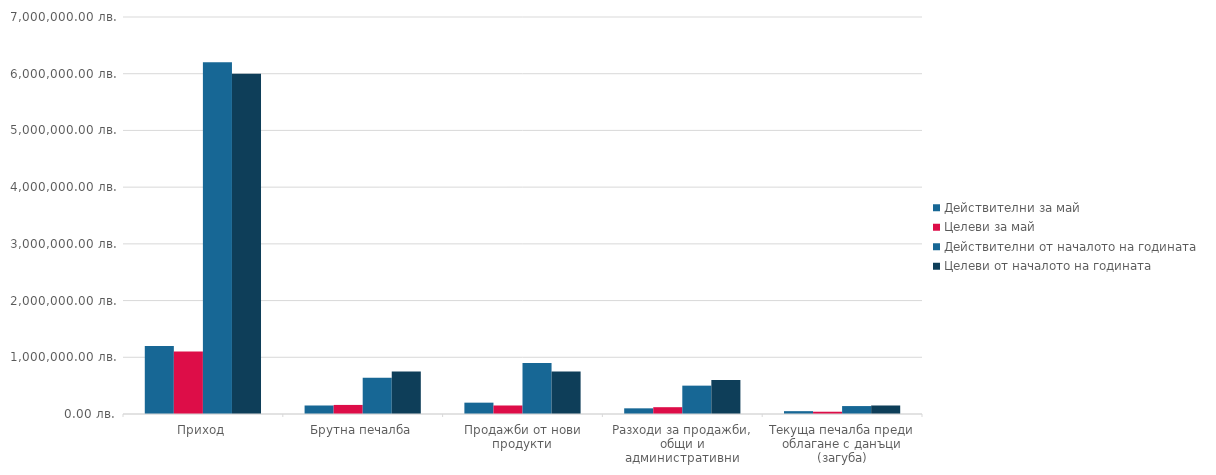
| Category | Действителни за май | Целеви за май | Действителни от началото на годината | Целеви от началото на годината |
|---|---|---|---|---|
| Приход | 1200000 | 1100000 | 6200000 | 6000000 |
| Брутна печалба | 150000 | 160000 | 640000 | 750000 |
| Продажби от нови продукти | 200000 | 150000 | 900000 | 750000 |
| Разходи за продажби, общи и административни | 100000 | 120000 | 500000 | 600000 |
| Текуща печалба преди облагане с данъци (загуба) | 50000 | 40000 | 140000 | 150000 |